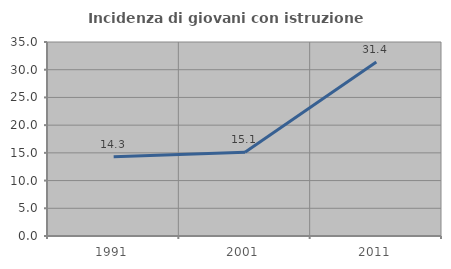
| Category | Incidenza di giovani con istruzione universitaria |
|---|---|
| 1991.0 | 14.286 |
| 2001.0 | 15.116 |
| 2011.0 | 31.373 |